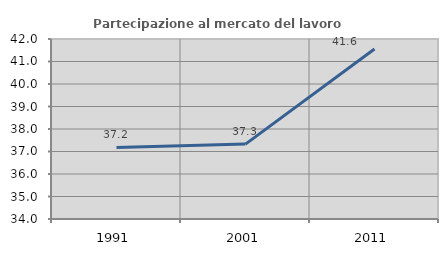
| Category | Partecipazione al mercato del lavoro  femminile |
|---|---|
| 1991.0 | 37.182 |
| 2001.0 | 37.329 |
| 2011.0 | 41.557 |